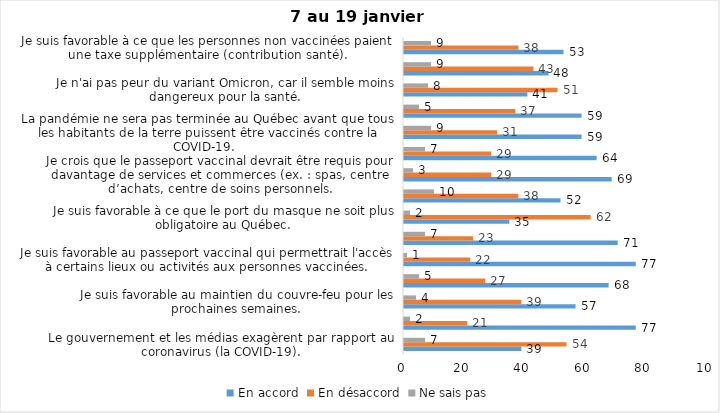
| Category | En accord | En désaccord | Ne sais pas |
|---|---|---|---|
| Le gouvernement et les médias exagèrent par rapport au coronavirus (la COVID-19). | 39 | 54 | 7 |
| J’ai peur que le système de santé soit débordé par les cas de COVID-19. | 77 | 21 | 2 |
| Je suis favorable au maintien du couvre-feu pour les prochaines semaines. | 57 | 39 | 4 |
| Je suis inquiet/inquiète que le nombre de cas augmente en raison des nouveaux variants du virus de la COVID-19. | 68 | 27 | 5 |
| Je suis favorable au passeport vaccinal qui permettrait l'accès à certains lieux ou activités aux personnes vaccinées. | 77 | 22 | 1 |
| Je suis confiant que la vaccination protège efficacement contre les variants de la COVID-19 | 71 | 23 | 7 |
| Je suis favorable à ce que le port du masque ne soit plus obligatoire au Québec. | 35 | 62 | 2 |
| J'ai peur que la reprise des cours en présentiel dans les écoles primaires et secondaires génère une augmentation des cas de COVID-19 | 52 | 38 | 10 |
| Je crois que le passeport vaccinal devrait être requis pour davantage de services et commerces (ex. : spas, centre d’achats, centre de soins personnels. | 69 | 29 | 3 |
| Les personnes non adéquatement vaccinées contre la COVID-19 sont responsables des nouveaux cas et hospitalisations et contribuent à la prolongation de la pandémie au Québec. | 64 | 29 | 7 |
| La pandémie ne sera pas terminée au Québec avant que tous les habitants de la terre puissent être vaccinés contre la COVID-19.   | 59 | 31 | 9 |
| Je suis inconfortable d’être en contact avec une personne non vaccinée contre la COVID-19 | 59 | 37 | 5 |
| Je n'ai pas peur du variant Omicron, car il semble moins dangereux pour la santé. | 41 | 51 | 8 |
| La vaccination obligatoire contre la COVID-19 mettrait fin à la pandémie. | 48 | 43 | 9 |
| Je suis favorable à ce que les personnes non vaccinées paient une taxe supplémentaire (contribution santé). | 53 | 38 | 9 |